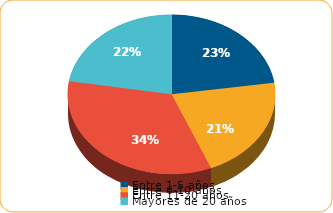
| Category | Series 0 |
|---|---|
| Entre 1-5 años | 3215.1 |
| Entre 6-10 años | 3001.2 |
| Entre 11-20 años | 4803.7 |
| Mayores de 20 años | 3174.5 |